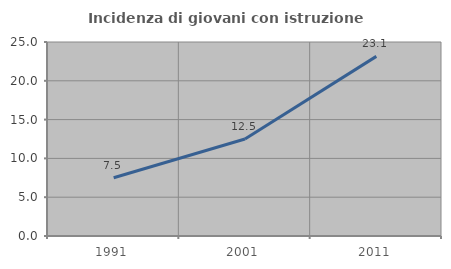
| Category | Incidenza di giovani con istruzione universitaria |
|---|---|
| 1991.0 | 7.5 |
| 2001.0 | 12.5 |
| 2011.0 | 23.148 |